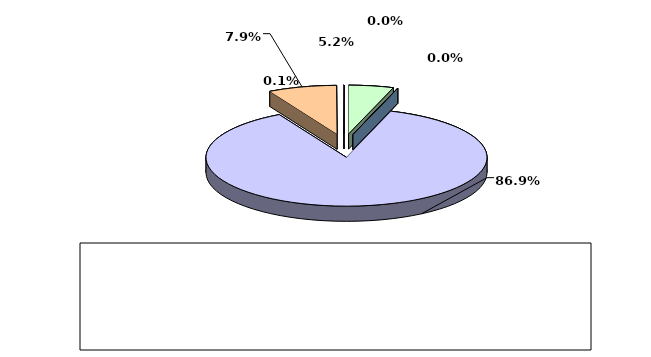
| Category | Series 0 |
|---|---|
| מזומנים ושווי מזומנים | 0.052 |
| אג"ח ממשלתיות סחירות | 0 |
| אג"ח קונצרני סחיר | 0 |
| ני"ע אחרים סחירים | 0.869 |
| פקדונות והלוואות | 0.079 |
| השקעות אחרות | 0.001 |